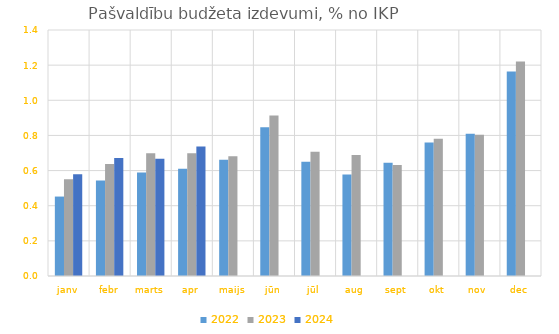
| Category | 2022 | 2023 | 2024 |
|---|---|---|---|
| janv | 0.452 | 0.55 | 0.579 |
| febr | 0.544 | 0.638 | 0.671 |
| marts | 0.589 | 0.698 | 0.667 |
| apr | 0.61 | 0.699 | 0.737 |
| maijs | 0.662 | 0.681 | 0 |
| jūn | 0.847 | 0.914 | 0 |
| jūl | 0.65 | 0.707 | 0 |
| aug | 0.578 | 0.688 | 0 |
| sept | 0.644 | 0.632 | 0 |
| okt | 0.759 | 0.781 | 0 |
| nov | 0.809 | 0.804 | 0 |
| dec | 1.164 | 1.221 | 0 |